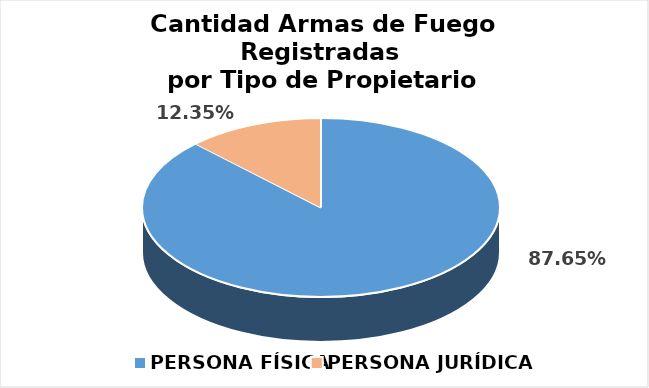
| Category | Series 0 |
|---|---|
| PERSONA FÍSICA | 0.876 |
| PERSONA JURÍDICA | 0.124 |